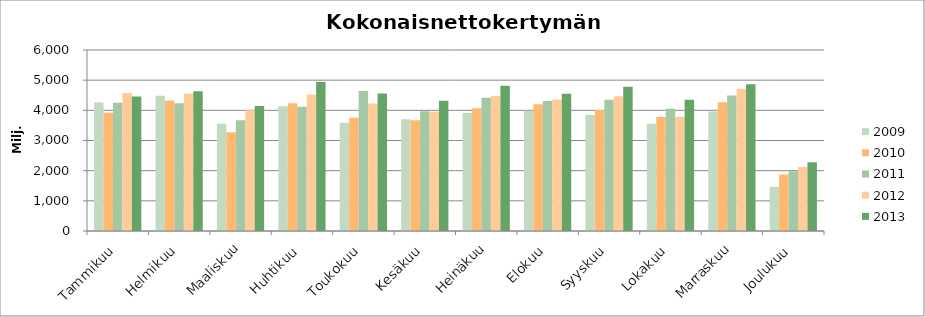
| Category | 2009 | 2010 | 2011 | 2012 | 2013 |
|---|---|---|---|---|---|
| Tammikuu | 4262.104 | 3920.596 | 4254.457 | 4574.273 | 4458.574 |
| Helmikuu | 4482.61 | 4324.273 | 4236.531 | 4556.683 | 4631.184 |
| Maaliskuu | 3551.222 | 3273.1 | 3667.911 | 4003.705 | 4141.995 |
| Huhtikuu | 4137.11 | 4235.283 | 4118.677 | 4521.853 | 4938.018 |
| Toukokuu | 3589.232 | 3758.246 | 4645.002 | 4229.781 | 4554.199 |
| Kesäkuu | 3701.617 | 3667.134 | 3966.073 | 3950.962 | 4320.908 |
| Heinäkuu | 3908.058 | 4070.751 | 4417.867 | 4473.488 | 4813.288 |
| Elokuu | 3983.999 | 4202.024 | 4310.334 | 4361.243 | 4548.338 |
| Syyskuu | 3843.197 | 4009.059 | 4353.55 | 4465.954 | 4780.078 |
| Lokakuu | 3558.554 | 3781.91 | 4052.329 | 3783.435 | 4353.533 |
| Marraskuu | 3964.456 | 4269.91 | 4491.275 | 4716.744 | 4864.184 |
| Joulukuu | 1461.632 | 1872.231 | 1978.993 | 2124.114 | 2277.179 |